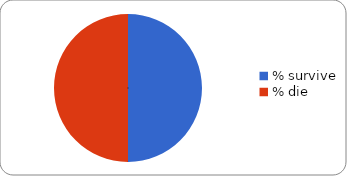
| Category | Series 0 |
|---|---|
| % survive | 0.5 |
| % die | 0.5 |